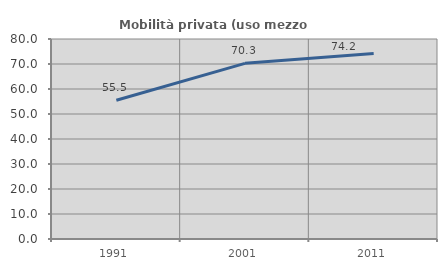
| Category | Mobilità privata (uso mezzo privato) |
|---|---|
| 1991.0 | 55.507 |
| 2001.0 | 70.258 |
| 2011.0 | 74.184 |